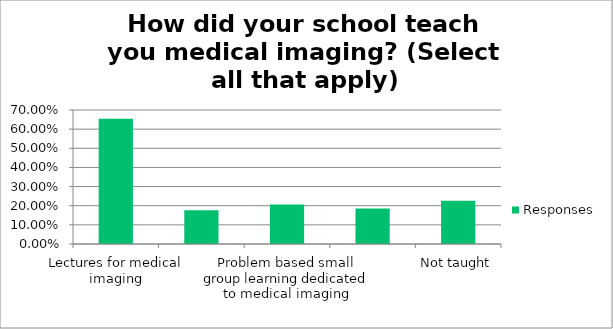
| Category | Responses |
|---|---|
| Lectures for medical imaging | 0.654 |
| Self-guided learning with images provided | 0.176 |
| Problem based small group learning dedicated to medical imaging | 0.206 |
| Image assessment during rounds | 0.185 |
| Not taught | 0.226 |